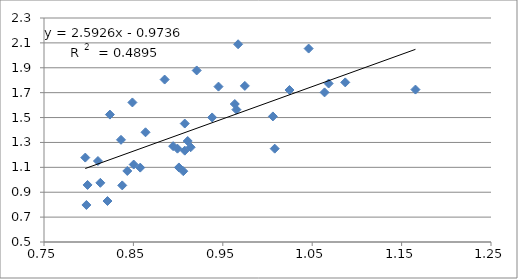
| Category | Series 0 |
|---|---|
| 0.7961783439490445 | 1.178 |
| 0.7987220447284346 | 0.958 |
| 0.8635578583765112 | 1.382 |
| 0.7974481658692185 | 0.797 |
| 0.8210180623973727 | 0.829 |
| 0.8130081300813008 | 0.976 |
| 0.8103727714748784 | 1.151 |
| 0.9057971014492754 | 1.069 |
| 0.8503401360544218 | 1.122 |
| 0.8576329331046312 | 1.098 |
| 0.8361204013377925 | 1.321 |
| 0.8375209380234506 | 0.955 |
| 0.8488964346349746 | 1.621 |
| 0.9380863039399625 | 1.501 |
| 0.8992805755395684 | 1.25 |
| 0.9208103130755065 | 1.878 |
| 1.0080645161290323 | 1.25 |
| 0.8431703204047218 | 1.071 |
| 0.8944543828264758 | 1.27 |
| 0.8237232289950577 | 1.524 |
| 0.9140767824497258 | 1.261 |
| 0.9074410163339384 | 1.234 |
| 0.9107468123861566 | 1.311 |
| 0.945179584120983 | 1.749 |
| 0.9009009009009009 | 1.099 |
| 0.9671179883945842 | 2.089 |
| 0.9746588693957116 | 1.754 |
| 0.9074410163339384 | 1.452 |
| 1.0245901639344261 | 1.721 |
| 1.1655011655011656 | 1.725 |
| 0.9652509652509653 | 1.564 |
| 1.0638297872340425 | 1.702 |
| 0.8849557522123893 | 1.805 |
| 1.0869565217391306 | 1.783 |
| 1.006036217303823 | 1.509 |
| 1.0683760683760684 | 1.774 |
| 1.0460251046025104 | 2.054 |
| 0.9633911368015413 | 1.609 |